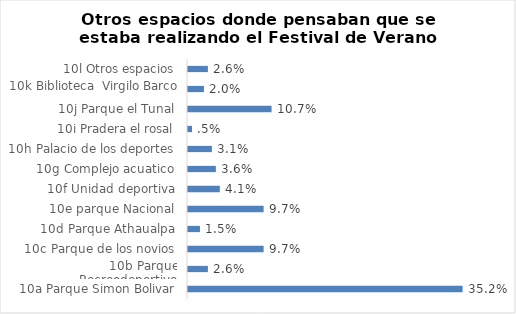
| Category | Series 0 |
|---|---|
| 10a Parque Simon Bolivar | 0.352 |
| 10b Parque Recreodeportivo | 0.026 |
| 10c Parque de los novios | 0.097 |
| 10d Parque Athaualpa | 0.015 |
| 10e parque Nacional | 0.097 |
| 10f Unidad deportiva | 0.041 |
| 10g Complejo acuatico | 0.036 |
| 10h Palacio de los deportes | 0.031 |
| 10i Pradera el rosal | 0.005 |
| 10j Parque el Tunal | 0.107 |
| 10k Biblioteca  Virgilo Barco | 0.02 |
| 10l Otros espacios | 0.026 |